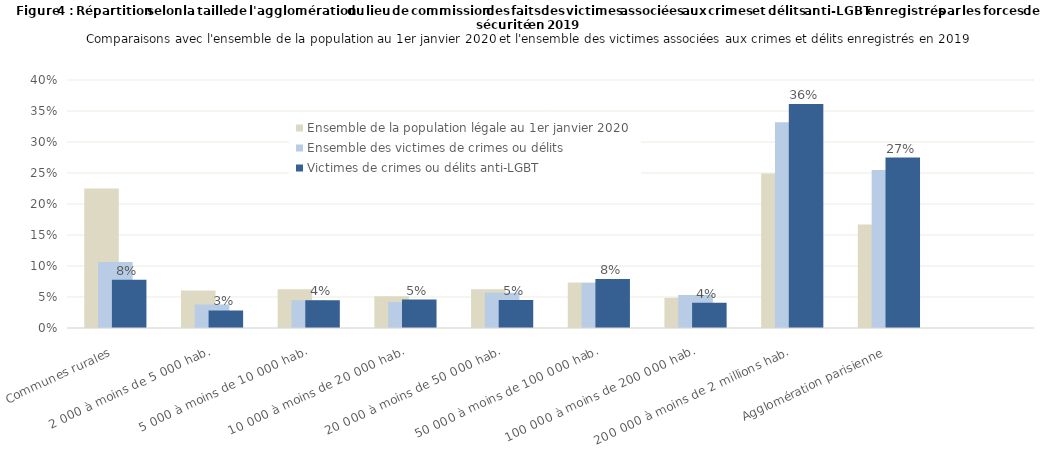
| Category | Ensemble de la population légale au 1er janvier 2020 | Ensemble des victimes de crimes ou délits | Victimes de crimes ou délits anti-LGBT |
|---|---|---|---|
| Communes rurales | 0.225 | 0.106 | 0.078 |
| 2 000 à moins de 5 000 hab. | 0.061 | 0.038 | 0.028 |
| 5 000 à moins de 10 000 hab. | 0.063 | 0.045 | 0.045 |
| 10 000 à moins de 20 000 hab. | 0.051 | 0.042 | 0.046 |
| 20 000 à moins de 50 000 hab. | 0.062 | 0.057 | 0.045 |
| 50 000 à moins de 100 000 hab. | 0.073 | 0.073 | 0.079 |
| 100 000 à moins de 200 000 hab. | 0.049 | 0.053 | 0.041 |
| 200 000 à moins de 2 millions hab. | 0.249 | 0.332 | 0.361 |
| Agglomération parisienne | 0.167 | 0.255 | 0.275 |